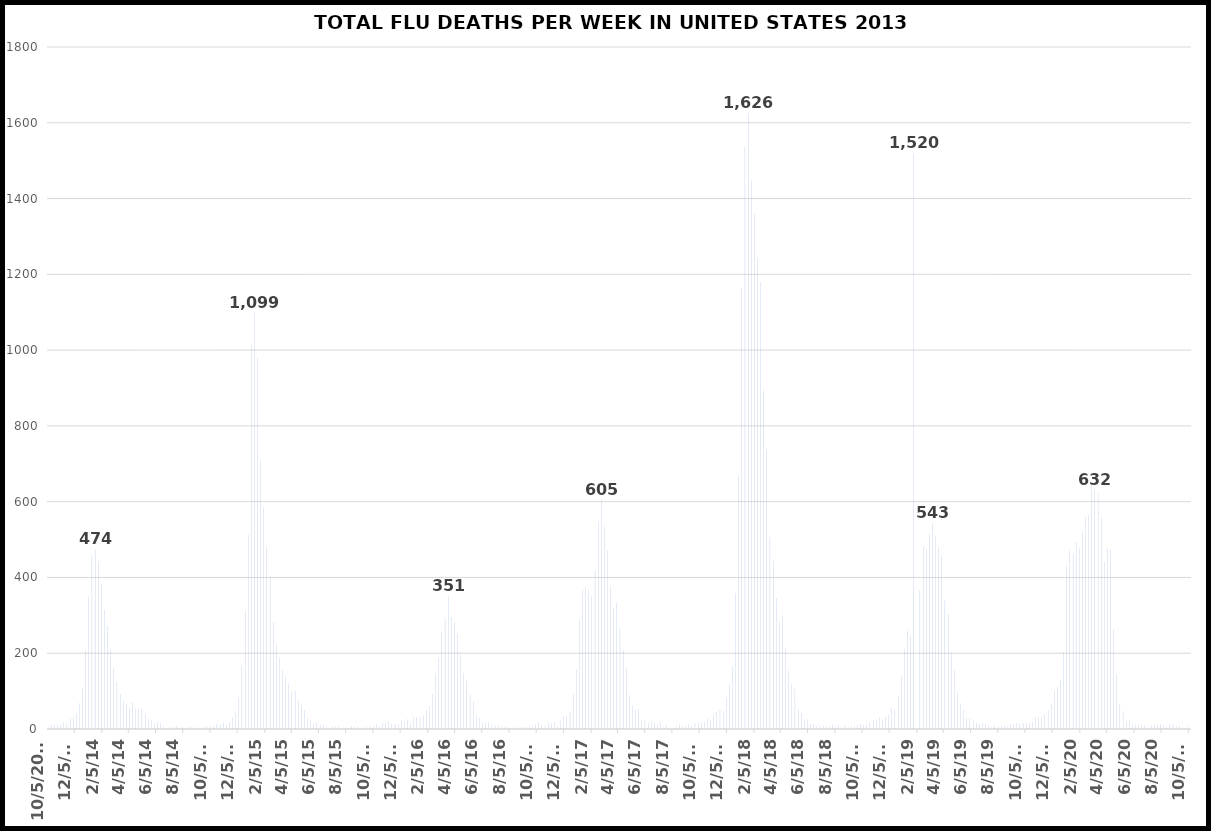
| Category | TOTAL DEATHS |
|---|---|
| 10/5/13 | 3 |
| 10/12/13 | 12 |
| 10/19/13 | 11 |
| 10/26/13 | 11 |
| 11/2/13 | 12 |
| 11/9/13 | 17 |
| 11/16/13 | 15 |
| 11/23/13 | 28 |
| 11/30/13 | 33 |
| 12/7/13 | 42 |
| 12/14/13 | 68 |
| 12/21/13 | 107 |
| 12/28/13 | 207 |
| 1/4/14 | 350 |
| 1/11/14 | 459 |
| 1/18/14 | 474 |
| 1/25/14 | 442 |
| 2/1/14 | 385 |
| 2/8/14 | 315 |
| 2/15/14 | 271 |
| 2/22/14 | 209 |
| 3/1/14 | 161 |
| 3/8/14 | 125 |
| 3/15/14 | 93 |
| 3/22/14 | 74 |
| 3/29/14 | 65 |
| 4/5/14 | 55 |
| 4/12/14 | 72 |
| 4/19/14 | 53 |
| 4/26/14 | 54 |
| 5/3/14 | 53 |
| 5/10/14 | 39 |
| 5/17/14 | 27 |
| 5/24/14 | 24 |
| 5/31/14 | 15 |
| 6/7/14 | 20 |
| 6/14/14 | 15 |
| 6/21/14 | 7 |
| 6/28/14 | 3 |
| 7/5/14 | 6 |
| 7/12/14 | 4 |
| 7/19/14 | 7 |
| 7/26/14 | 3 |
| 8/2/14 | 5 |
| 8/9/14 | 1 |
| 8/16/14 | 5 |
| 8/23/14 | 6 |
| 8/30/14 | 5 |
| 9/6/14 | 1 |
| 9/13/14 | 4 |
| 9/20/14 | 6 |
| 9/27/14 | 6 |
| 10/4/14 | 6 |
| 10/11/14 | 8 |
| 10/18/14 | 13 |
| 10/25/14 | 11 |
| 11/1/14 | 17 |
| 11/8/14 | 11 |
| 11/15/14 | 18 |
| 11/22/14 | 31 |
| 11/29/14 | 46 |
| 12/6/14 | 83 |
| 12/13/14 | 169 |
| 12/20/14 | 312 |
| 12/27/14 | 512 |
| 1/3/15 | 1014 |
| 1/10/15 | 1099 |
| 1/17/15 | 981 |
| 1/24/15 | 710 |
| 1/31/15 | 585 |
| 2/7/15 | 482 |
| 2/14/15 | 405 |
| 2/21/15 | 282 |
| 2/28/15 | 221 |
| 3/7/15 | 189 |
| 3/14/15 | 156 |
| 3/21/15 | 139 |
| 3/28/15 | 121 |
| 4/4/15 | 99 |
| 4/11/15 | 100 |
| 4/18/15 | 75 |
| 4/25/15 | 63 |
| 5/2/15 | 50 |
| 5/9/15 | 28 |
| 5/16/15 | 22 |
| 5/23/15 | 14 |
| 5/30/15 | 18 |
| 6/6/15 | 10 |
| 6/13/15 | 11 |
| 6/20/15 | 6 |
| 6/27/15 | 4 |
| 7/4/15 | 6 |
| 7/11/15 | 7 |
| 7/18/15 | 7 |
| 7/25/15 | 3 |
| 8/1/15 | 4 |
| 8/8/15 | 4 |
| 8/15/15 | 8 |
| 8/22/15 | 6 |
| 8/29/15 | 5 |
| 9/5/15 | 3 |
| 9/12/15 | 3 |
| 9/19/15 | 6 |
| 9/26/15 | 8 |
| 10/3/15 | 6 |
| 10/10/15 | 14 |
| 10/17/15 | 7 |
| 10/24/15 | 16 |
| 10/31/15 | 17 |
| 11/7/15 | 20 |
| 11/14/15 | 14 |
| 11/21/15 | 13 |
| 11/28/15 | 14 |
| 12/5/15 | 22 |
| 12/12/15 | 20 |
| 12/19/15 | 26 |
| 12/26/15 | 15 |
| 1/2/16 | 31 |
| 1/9/16 | 32 |
| 1/16/16 | 30 |
| 1/23/16 | 36 |
| 1/30/16 | 50 |
| 2/6/16 | 61 |
| 2/13/16 | 93 |
| 2/20/16 | 148 |
| 2/27/16 | 187 |
| 3/5/16 | 257 |
| 3/12/16 | 294 |
| 3/19/16 | 351 |
| 3/26/16 | 295 |
| 4/2/16 | 282 |
| 4/9/16 | 250 |
| 4/16/16 | 196 |
| 4/23/16 | 148 |
| 4/30/16 | 127 |
| 5/7/16 | 91 |
| 5/14/16 | 74 |
| 5/21/16 | 34 |
| 5/28/16 | 30 |
| 6/4/16 | 17 |
| 6/11/16 | 17 |
| 6/18/16 | 18 |
| 6/25/16 | 12 |
| 7/2/16 | 10 |
| 7/9/16 | 10 |
| 7/16/16 | 6 |
| 7/23/16 | 5 |
| 7/30/16 | 5 |
| 8/6/16 | 2 |
| 8/13/16 | 2 |
| 8/20/16 | 5 |
| 8/27/16 | 6 |
| 9/3/16 | 5 |
| 9/10/16 | 5 |
| 9/17/16 | 8 |
| 9/24/16 | 9 |
| 10/1/16 | 11 |
| 10/8/16 | 18 |
| 10/15/16 | 11 |
| 10/22/16 | 7 |
| 10/29/16 | 17 |
| 11/5/16 | 16 |
| 11/12/16 | 19 |
| 11/19/16 | 7 |
| 11/26/16 | 22 |
| 12/3/16 | 34 |
| 12/10/16 | 33 |
| 12/17/16 | 46 |
| 12/24/16 | 92 |
| 12/31/16 | 157 |
| 1/7/17 | 289 |
| 1/14/17 | 368 |
| 1/21/17 | 373 |
| 1/28/17 | 367 |
| 2/4/17 | 351 |
| 2/11/17 | 419 |
| 2/18/17 | 545 |
| 2/25/17 | 605 |
| 3/4/17 | 534 |
| 3/11/17 | 472 |
| 3/18/17 | 376 |
| 3/25/17 | 319 |
| 4/1/17 | 333 |
| 4/8/17 | 266 |
| 4/15/17 | 208 |
| 4/22/17 | 162 |
| 4/29/17 | 90 |
| 5/6/17 | 63 |
| 5/13/17 | 50 |
| 5/20/17 | 53 |
| 5/27/17 | 24 |
| 6/3/17 | 23 |
| 6/10/17 | 17 |
| 6/17/17 | 19 |
| 6/24/17 | 15 |
| 7/1/17 | 10 |
| 7/8/17 | 18 |
| 7/15/17 | 4 |
| 7/22/17 | 10 |
| 7/29/17 | 3 |
| 8/5/17 | 4 |
| 8/12/17 | 6 |
| 8/19/17 | 11 |
| 8/26/17 | 7 |
| 9/2/17 | 7 |
| 9/9/17 | 12 |
| 9/16/17 | 7 |
| 9/23/17 | 16 |
| 9/30/17 | 19 |
| 10/7/17 | 16 |
| 10/14/17 | 18 |
| 10/21/17 | 28 |
| 10/28/17 | 23 |
| 11/4/17 | 36 |
| 11/11/17 | 45 |
| 11/18/17 | 50 |
| 11/25/17 | 48 |
| 12/2/17 | 83 |
| 12/9/17 | 118 |
| 12/16/17 | 165 |
| 12/23/17 | 359 |
| 12/30/17 | 671 |
| 1/6/18 | 1165 |
| 1/13/18 | 1536 |
| 1/20/18 | 1626 |
| 1/27/18 | 1448 |
| 2/3/18 | 1360 |
| 2/10/18 | 1243 |
| 2/17/18 | 1179 |
| 2/24/18 | 892 |
| 3/3/18 | 738 |
| 3/10/18 | 507 |
| 3/17/18 | 444 |
| 3/24/18 | 345 |
| 3/31/18 | 284 |
| 4/7/18 | 300 |
| 4/14/18 | 214 |
| 4/21/18 | 153 |
| 4/28/18 | 119 |
| 5/5/18 | 106 |
| 5/12/18 | 53 |
| 5/19/18 | 43 |
| 5/26/18 | 26 |
| 6/2/18 | 26 |
| 6/9/18 | 14 |
| 6/16/18 | 14 |
| 6/23/18 | 7 |
| 6/30/18 | 9 |
| 7/7/18 | 10 |
| 7/14/18 | 5 |
| 7/21/18 | 8 |
| 7/28/18 | 12 |
| 8/4/18 | 4 |
| 8/11/18 | 10 |
| 8/18/18 | 5 |
| 8/25/18 | 10 |
| 9/1/18 | 6 |
| 9/8/18 | 6 |
| 9/15/18 | 8 |
| 9/22/18 | 11 |
| 9/29/18 | 14 |
| 10/6/18 | 10 |
| 10/13/18 | 12 |
| 10/20/18 | 18 |
| 10/27/18 | 24 |
| 11/3/18 | 25 |
| 11/10/18 | 30 |
| 11/17/18 | 26 |
| 11/24/18 | 31 |
| 12/1/18 | 38 |
| 12/8/18 | 56 |
| 12/15/18 | 51 |
| 12/22/18 | 88 |
| 12/29/18 | 141 |
| 1/5/19 | 211 |
| 1/12/19 | 259 |
| 1/19/19 | 246 |
| 1/26/19 | 1520 |
| 2/2/19 | 0 |
| 2/9/19 | 366 |
| 2/16/19 | 482 |
| 2/23/19 | 474 |
| 3/2/19 | 516 |
| 3/9/19 | 543 |
| 3/16/19 | 511 |
| 3/23/19 | 480 |
| 3/30/19 | 459 |
| 4/6/19 | 339 |
| 4/13/19 | 303 |
| 4/20/19 | 202 |
| 4/27/19 | 156 |
| 5/4/19 | 97 |
| 5/11/19 | 68 |
| 5/18/19 | 50 |
| 5/25/19 | 30 |
| 6/1/19 | 29 |
| 6/8/19 | 21 |
| 6/15/19 | 16 |
| 6/22/19 | 13 |
| 6/29/19 | 15 |
| 7/6/19 | 13 |
| 7/13/19 | 11 |
| 7/20/19 | 5 |
| 7/27/19 | 8 |
| 8/3/19 | 6 |
| 8/10/19 | 7 |
| 8/17/19 | 8 |
| 8/24/19 | 6 |
| 8/31/19 | 13 |
| 9/7/19 | 12 |
| 9/14/19 | 16 |
| 9/21/19 | 14 |
| 9/28/19 | 16 |
| 10/5/19 | 16 |
| 10/12/19 | 16 |
| 10/19/19 | 18 |
| 10/26/19 | 30 |
| 11/2/19 | 31 |
| 11/9/19 | 31 |
| 11/16/19 | 39 |
| 11/23/19 | 50 |
| 11/30/19 | 66 |
| 12/7/19 | 100 |
| 12/14/19 | 111 |
| 12/21/19 | 129 |
| 12/28/19 | 203 |
| 1/4/20 | 431 |
| 1/11/20 | 471 |
| 1/18/20 | 464 |
| 1/25/20 | 494 |
| 2/1/20 | 478 |
| 2/8/20 | 520 |
| 2/15/20 | 559 |
| 2/22/20 | 565 |
| 2/29/20 | 653 |
| 3/7/20 | 632 |
| 3/14/20 | 622 |
| 3/21/20 | 557 |
| 3/28/20 | 440 |
| 4/4/20 | 477 |
| 4/11/20 | 473 |
| 4/18/20 | 264 |
| 4/25/20 | 144 |
| 5/2/20 | 65 |
| 5/9/20 | 47 |
| 5/16/20 | 21 |
| 5/23/20 | 24 |
| 5/30/20 | 12 |
| 6/6/20 | 11 |
| 6/13/20 | 11 |
| 6/20/20 | 8 |
| 6/27/20 | 11 |
| 7/4/20 | 3 |
| 7/11/20 | 10 |
| 7/18/20 | 12 |
| 7/25/20 | 10 |
| 8/1/20 | 13 |
| 8/8/20 | 9 |
| 8/15/20 | 5 |
| 8/22/20 | 12 |
| 8/29/20 | 11 |
| 9/5/20 | 8 |
| 9/12/20 | 7 |
| 9/19/20 | 5 |
| 9/26/20 | 2 |
| 10/3/20 | 5 |
| 10/10/20 | 2 |